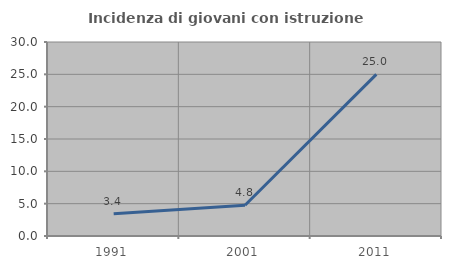
| Category | Incidenza di giovani con istruzione universitaria |
|---|---|
| 1991.0 | 3.448 |
| 2001.0 | 4.762 |
| 2011.0 | 25 |